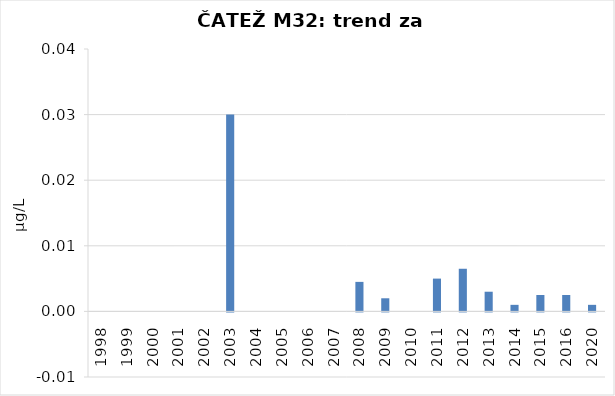
| Category | Vsota |
|---|---|
| 1998 | 0 |
| 1999 | 0 |
| 2000 | 0 |
| 2001 | 0 |
| 2002 | 0 |
| 2003 | 0.03 |
| 2004 | 0 |
| 2005 | 0 |
| 2006 | 0 |
| 2007 | 0 |
| 2008 | 0.004 |
| 2009 | 0.002 |
| 2010 | 0 |
| 2011 | 0.005 |
| 2012 | 0.007 |
| 2013 | 0.003 |
| 2014 | 0.001 |
| 2015 | 0.002 |
| 2016 | 0.002 |
| 2020 | 0.001 |